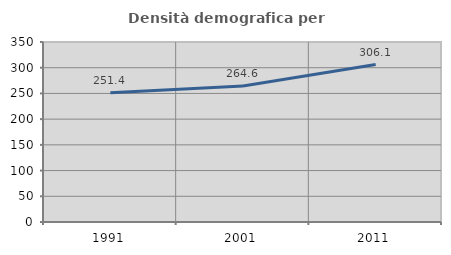
| Category | Densità demografica |
|---|---|
| 1991.0 | 251.443 |
| 2001.0 | 264.609 |
| 2011.0 | 306.104 |